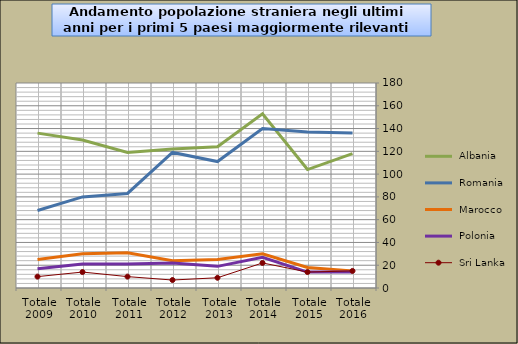
| Category |  Albania  |  Romania  |  Marocco  |  Polonia  |  Sri Lanka  |
|---|---|---|---|---|---|
| Totale 2016 | 118 | 136 | 15 | 14 | 15 |
| Totale 2015 | 104 | 137 | 18 | 14 | 14 |
| Totale 2014 | 153 | 140 | 30 | 27 | 22 |
| Totale 2013 | 124 | 111 | 25 | 19 | 9 |
| Totale 2012 | 122 | 119 | 24 | 22 | 7 |
| Totale 2011 | 119 | 83 | 31 | 21 | 10 |
| Totale 2010 | 130 | 80 | 30 | 21 | 14 |
| Totale 2009 | 136 | 68 | 25 | 17 | 10 |